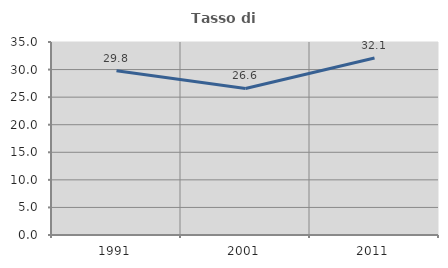
| Category | Tasso di occupazione   |
|---|---|
| 1991.0 | 29.771 |
| 2001.0 | 26.571 |
| 2011.0 | 32.11 |